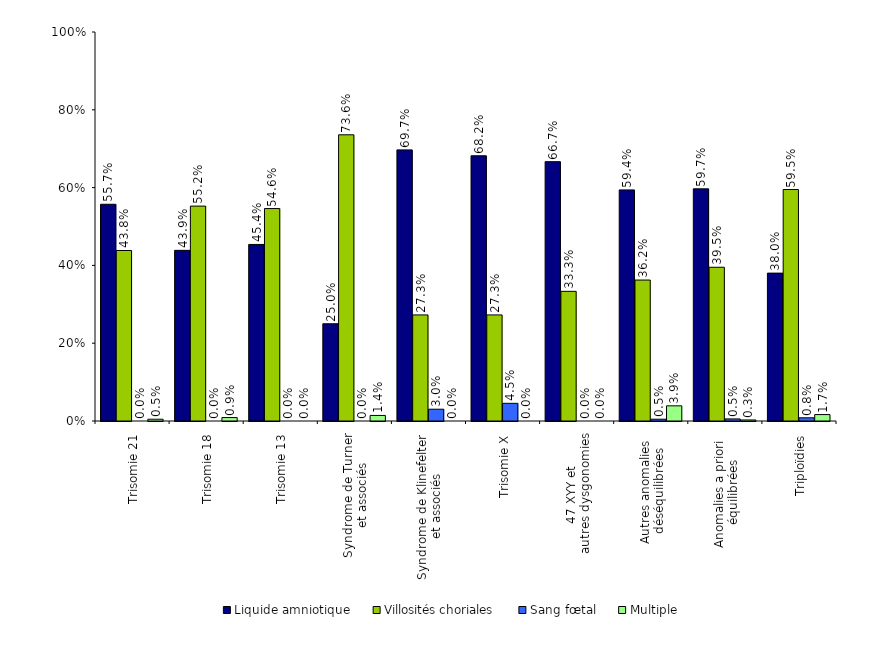
| Category | Liquide amniotique | Villosités choriales | Sang fœtal | Multiple |
|---|---|---|---|---|
| Trisomie 21 | 0.557 | 0.438 | 0 | 0.005 |
| Trisomie 18 | 0.439 | 0.552 | 0 | 0.009 |
| Trisomie 13 | 0.454 | 0.546 | 0 | 0 |
| Syndrome de Turner
 et associés | 0.25 | 0.736 | 0 | 0.014 |
| Syndrome de Klinefelter
 et associés | 0.697 | 0.273 | 0.03 | 0 |
| Trisomie X | 0.682 | 0.273 | 0.045 | 0 |
| 47 XYY et 
autres dysgonomies | 0.667 | 0.333 | 0 | 0 |
| Autres anomalies 
déséquilibrées | 0.594 | 0.362 | 0.005 | 0.039 |
| Anomalies a priori 
équilibrées | 0.597 | 0.395 | 0.005 | 0.003 |
| Triploïdies | 0.38 | 0.595 | 0.008 | 0.017 |